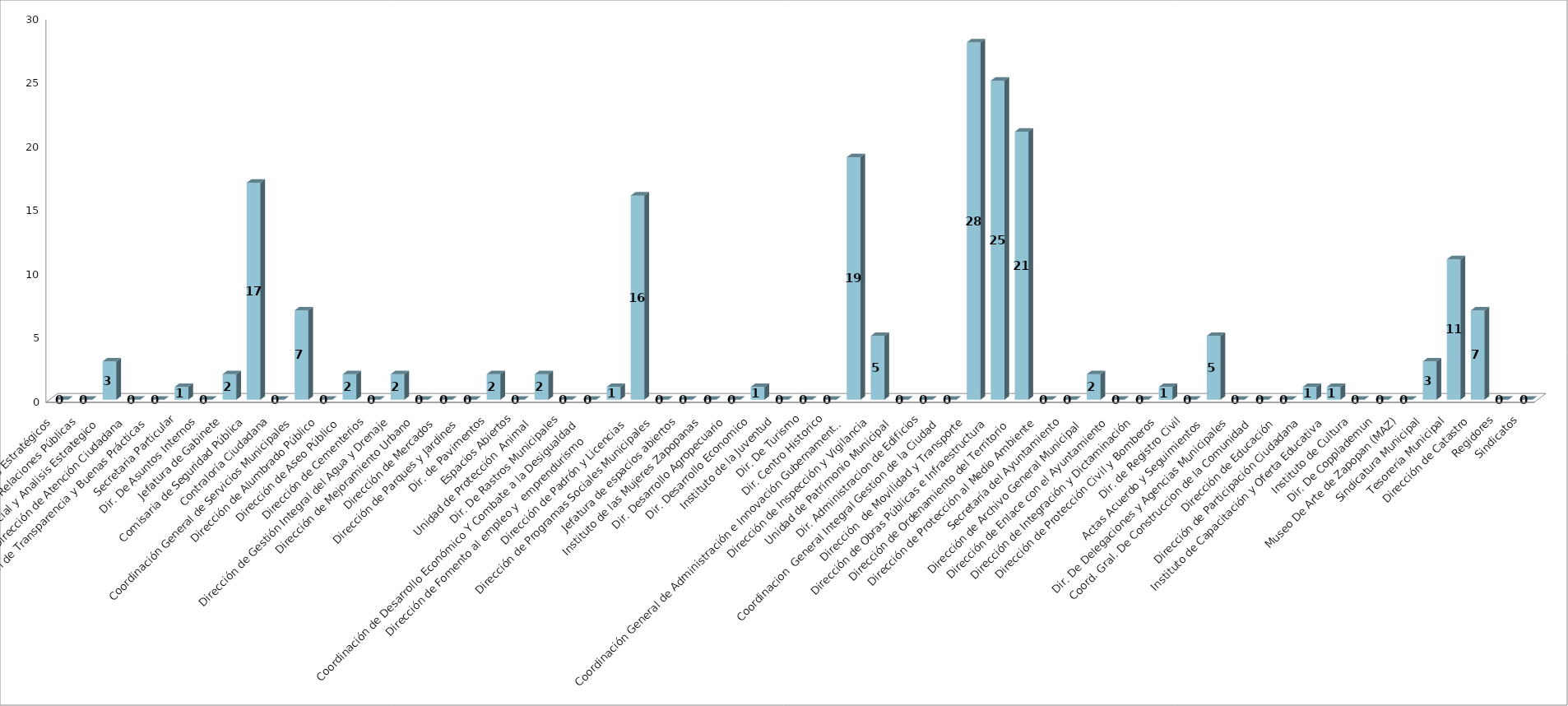
| Category | Series 0 | Series 1 |
|---|---|---|
| Area de Proyectos Estratégicos |  | 0 |
| Área de Relaciones Públicas |  | 0 |
| Comunicación Social y Analisis Estrategico  |  | 3 |
| Dirección de Atención Ciudadana |  | 0 |
| Dirección de Transparencia y Buenas Prácticas |  | 0 |
| Secretaria Particular |  | 1 |
| Dir. De Asuntos Internos |  | 0 |
| Jefatura de Gabinete |  | 2 |
| Comisaria de Seguridad Pública |  | 17 |
| Contraloría Ciudadana |  | 0 |
| Coordinación General de Servicios Municipales |  | 7 |
| Dirección de Alumbrado Público |  | 0 |
| Dirección de Aseo Público  |  | 2 |
| Dirección de Cementerios |  | 0 |
| Dirección de Gestión Integral del Agua y Drenaje |  | 2 |
| Dirección de Mejoramiento Urbano |  | 0 |
| Dirección de Mercados  |  | 0 |
| Dirección de Parques y Jardines  |  | 0 |
| Dir. de Pavimentos |  | 2 |
| Espacios Abiertos |  | 0 |
| Unidad de Protección  Animal  |  | 2 |
| Dir. De Rastros Municipales |  | 0 |
| Coordinación de Desarrollo Económico Y Combate a la Desigualdad |  | 0 |
| Dirección de Fomento al empleo y  emprendurismo         |  | 1 |
| Dirección de Padrón y Licencias  |  | 16 |
| Dirección de Programas Sociales Municipales |  | 0 |
| Jefatura de espacios abiertos |  | 0 |
| Instituto de las Mujeres Zapopanas |  | 0 |
|  Dir. Desarrollo Agropecuario |  | 0 |
| Dir. Desarrollo Economico |  | 1 |
| Instituto de la Juventud |  | 0 |
| Dir. De Turismo |  | 0 |
| Dir. Centro Historico |  | 0 |
| Coordinación General de Administración e Innovación Gubernamental |  | 19 |
| Dirección de Inspección y Vigilancia |  | 5 |
| Unidad de Patrimonio Municipal  |  | 0 |
| Dir. Administracion de Edificios |  | 0 |
| Coordinacion  General Integral Gestion de la Ciudad |  | 0 |
| Dirección  de Movilidad y Transporte |  | 28 |
| Dirección de Obras Públicas e Infraestructura |  | 25 |
| Dirección de Ordenamiento del Territorio  |  | 21 |
| Dirección de Protección al Medio Ambiente  |  | 0 |
| Secretaría del Ayuntamiento |  | 0 |
| Dirección de Archivo General Municipal  |  | 2 |
| Dirección de Enlace con el Ayuntamiento |  | 0 |
| Dirección de Integración y Dictaminación |  | 0 |
| Dirección de Protección Civil y Bomberos |  | 1 |
| Dir. de Registro Civil |  | 0 |
| Actas Acuerdo y Seguimientos  |  | 5 |
| Dir. De Delegaciones y Agencias Municipales |  | 0 |
| Coord. Gral. De Construccion de la Comunidad |  | 0 |
| Dirección de Educación  |  | 0 |
| Dirección de Participación Ciudadana |  | 1 |
| Instituto de Capacitación y Oferta Educativa |  | 1 |
| Instituto de Cultura  |  | 0 |
| Dir. De Copplademun |  | 0 |
| Museo De Arte de Zapopan (MAZ) |  | 0 |
| Sindicatura Municipal |  | 3 |
| Tesorería Municipal |  | 11 |
| Dirección de Catastro |  | 7 |
| Regidores |  | 0 |
| Sindicatos |  | 0 |